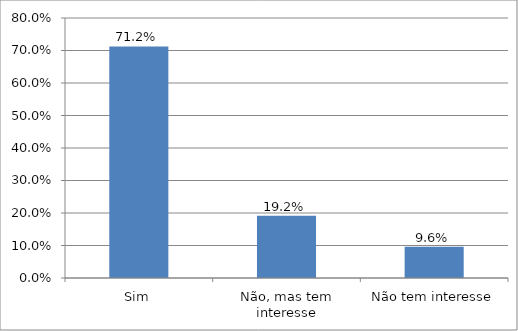
| Category | Series 0 |
|---|---|
| Sim | 0.712 |
| Não, mas tem interesse | 0.192 |
| Não tem interesse | 0.096 |